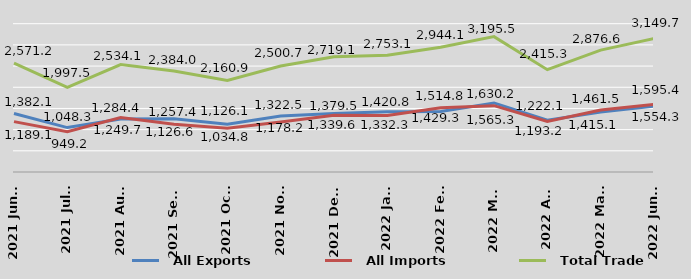
| Category |   All Exports |   All Imports |   Total Trade |
|---|---|---|---|
| 2021 June | 1382.1 | 1189.1 | 2571.2 |
| 2021 July | 1048.3 | 949.2 | 1997.5 |
| 2021 Aug | 1249.7 | 1284.4 | 2534.1 |
| 2021 Sept | 1257.4 | 1126.6 | 2384 |
| 2021 Oct | 1126.1 | 1034.8 | 2160.9 |
| 2021 Nov | 1322.5 | 1178.2 | 2500.7 |
| 2021 Dec  | 1379.5 | 1339.6 | 2719.1 |
| 2022 Jan | 1420.8 | 1332.3 | 2753.1 |
| 2022 Feb | 1429.3 | 1514.8 | 2944.1 |
| 2022 Mar | 1630.2 | 1565.3 | 3195.5 |
| 2022 Apr | 1222.1 | 1193.2 | 2415.3 |
| 2022 May | 1415.1 | 1461.5 | 2876.6 |
| 2022 June | 1554.3 | 1595.4 | 3149.7 |